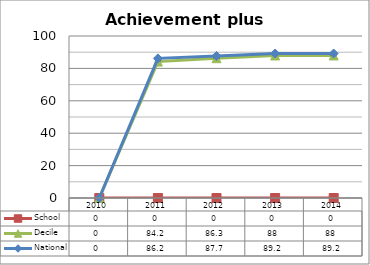
| Category | School  | Decile | National |
|---|---|---|---|
| 2010.0 | 0 | 0 | 0 |
| 2011.0 | 0 | 84.2 | 86.2 |
| 2012.0 | 0 | 86.3 | 87.7 |
| 2013.0 | 0 | 88 | 89.2 |
| 2014.0 | 0 | 88 | 89.2 |